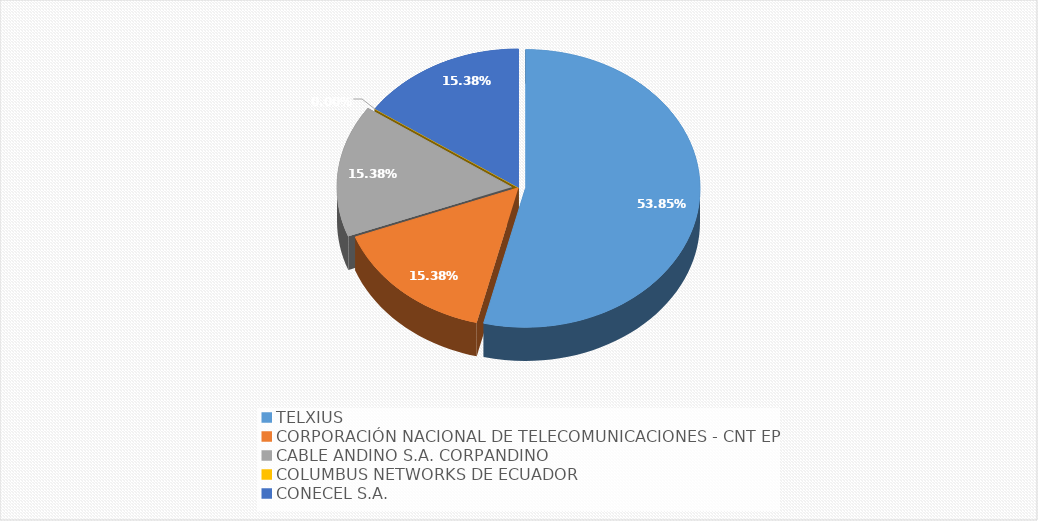
| Category | Series 0 |
|---|---|
| TELXIUS | 0.538 |
| CORPORACIÓN NACIONAL DE TELECOMUNICACIONES - CNT EP | 0.154 |
| CABLE ANDINO S.A. CORPANDINO | 0.154 |
| COLUMBUS NETWORKS DE ECUADOR | 0 |
| CONECEL S.A. | 0.154 |